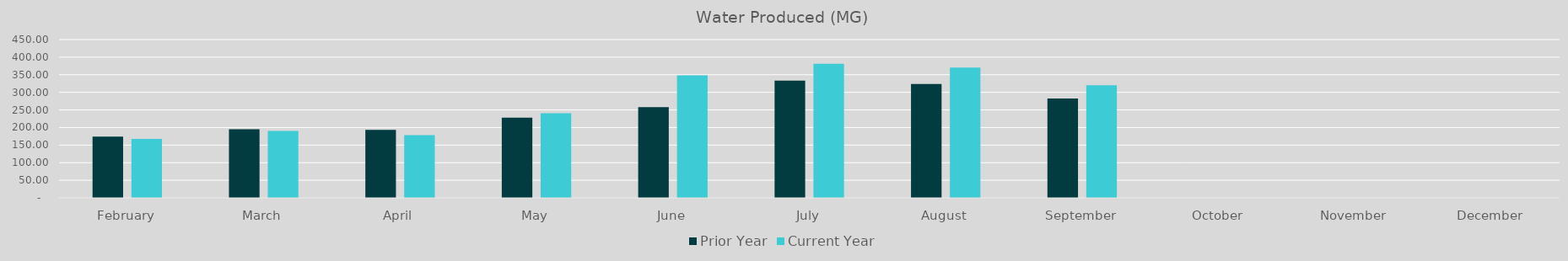
| Category | Prior Year | Current Year |
|---|---|---|
| February | 173.847 | 167.532 |
| March | 195.333 | 190.306 |
| April | 193.551 | 178.22 |
| May | 228.091 | 240.625 |
| June | 257.9 | 348.57 |
| July | 333.37 | 381.34 |
| August | 323.49 | 370.12 |
| September | 282.53 | 320.39 |
| October | 0 | 0 |
| November | 0 | 0 |
| December | 0 | 0 |